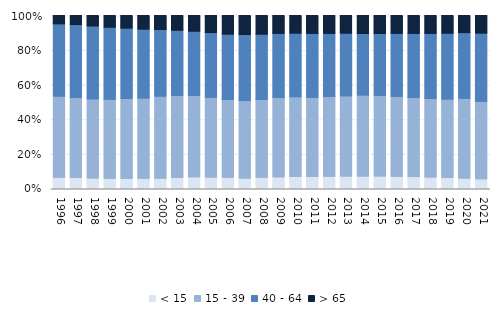
| Category | < 15 | 15 - 39 | 40 - 64 | > 65 |
|---|---|---|---|---|
| 1996.0 | 6.473 | 47.026 | 41.774 | 4.727 |
| 1997.0 | 6.384 | 46.185 | 42.203 | 5.228 |
| 1998.0 | 6.133 | 45.724 | 42.158 | 5.985 |
| 1999.0 | 5.91 | 45.747 | 41.637 | 6.706 |
| 2000.0 | 5.795 | 46.219 | 40.824 | 7.162 |
| 2001.0 | 5.872 | 46.431 | 39.95 | 7.747 |
| 2002.0 | 5.975 | 47.426 | 38.562 | 8.038 |
| 2003.0 | 6.442 | 47.442 | 37.681 | 8.434 |
| 2004.0 | 6.795 | 47.157 | 37.062 | 8.986 |
| 2005.0 | 6.676 | 46.108 | 37.37 | 9.845 |
| 2006.0 | 6.47 | 45.014 | 37.858 | 10.657 |
| 2007.0 | 6.064 | 44.74 | 38.224 | 10.972 |
| 2008.0 | 6.452 | 45.055 | 37.76 | 10.733 |
| 2009.0 | 6.737 | 45.953 | 37.062 | 10.249 |
| 2010.0 | 6.98 | 46.099 | 36.849 | 10.072 |
| 2011.0 | 6.93 | 45.87 | 36.923 | 10.277 |
| 2012.0 | 7.116 | 46.032 | 36.542 | 10.311 |
| 2013.0 | 7.161 | 46.423 | 36.271 | 10.145 |
| 2014.0 | 7.213 | 46.898 | 35.493 | 10.396 |
| 2015.0 | 7.292 | 46.627 | 35.659 | 10.422 |
| 2016.0 | 7.037 | 46.224 | 36.465 | 10.274 |
| 2017.0 | 6.874 | 45.778 | 37.109 | 10.239 |
| 2018.0 | 6.69 | 45.331 | 37.668 | 10.311 |
| 2019.0 | 6.375 | 45.37 | 38.123 | 10.132 |
| 2020.0 | 6.044 | 46.06 | 38.007 | 9.889 |
| 2021.0 | 5.657 | 44.807 | 39.483 | 10.052 |